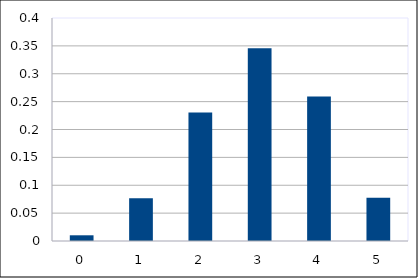
| Category | 0 |
|---|---|
| 0.0 | 0.01 |
| 1.0 | 0.077 |
| 2.0 | 0.23 |
| 3.0 | 0.346 |
| 4.0 | 0.259 |
| 5.0 | 0.078 |